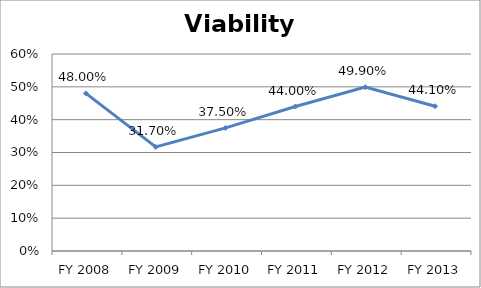
| Category | Viability ratio |
|---|---|
| FY 2013 | 0.441 |
| FY 2012 | 0.499 |
| FY 2011 | 0.44 |
| FY 2010 | 0.375 |
| FY 2009 | 0.317 |
| FY 2008 | 0.48 |